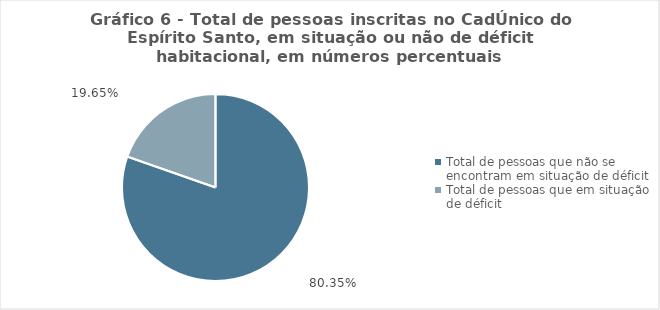
| Category | Series 0 |
|---|---|
| Total de pessoas que não se encontram em situação de déficit | 0.804 |
| Total de pessoas que em situação de déficit | 0.196 |